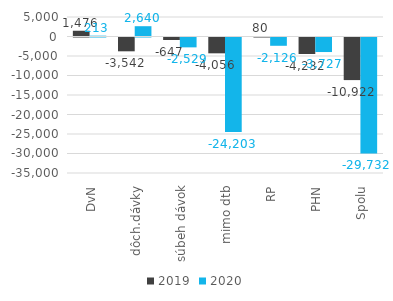
| Category | 2019 | 2020 |
|---|---|---|
| DvN | 1475.5 | 212.583 |
| dôch.dávky | -3541.75 | 2640 |
| súbeh dávok | -647.083 | -2529 |
| mimo dtb | -4056.25 | -24203.25 |
| RP | 80.333 | -2126.167 |
| PHN | -4232.417 | -3726.583 |
| Spolu | -10921.667 | -29732.417 |